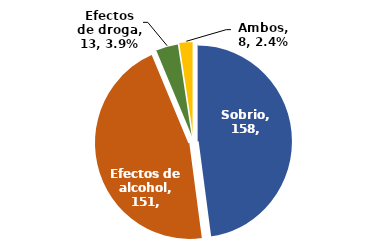
| Category | N° |
|---|---|
| Sobrio | 158 |
| Efectos de alcohol | 151 |
| Efectos de droga | 13 |
| Ambos | 8 |